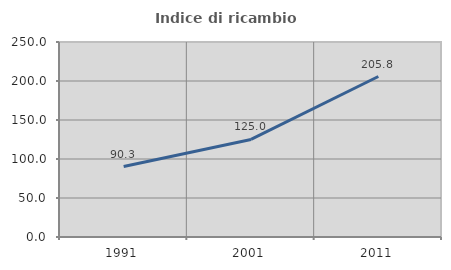
| Category | Indice di ricambio occupazionale  |
|---|---|
| 1991.0 | 90.334 |
| 2001.0 | 125.046 |
| 2011.0 | 205.765 |